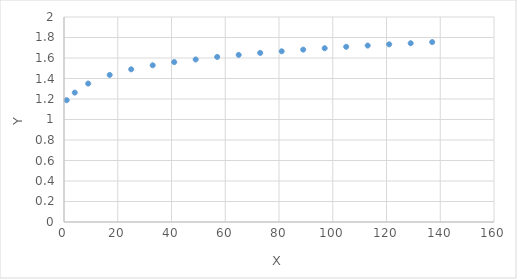
| Category | Y |
|---|---|
| 1.0 | 1.188 |
| 4.0 | 1.262 |
| 9.0 | 1.351 |
| 17.0 | 1.435 |
| 25.0 | 1.49 |
| 33.0 | 1.529 |
| 41.0 | 1.56 |
| 49.0 | 1.586 |
| 57.0 | 1.61 |
| 65.0 | 1.63 |
| 73.0 | 1.65 |
| 81.0 | 1.665 |
| 89.0 | 1.682 |
| 97.0 | 1.695 |
| 105.0 | 1.709 |
| 113.0 | 1.721 |
| 121.0 | 1.734 |
| 129.0 | 1.744 |
| 137.0 | 1.755 |